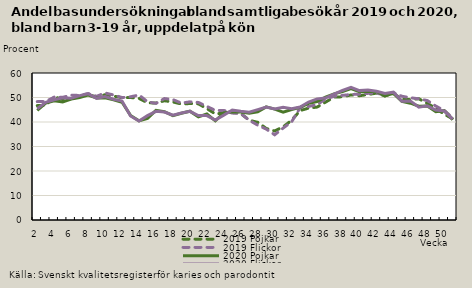
| Category | 2019 | 2020 |
|---|---|---|
| 2.0 | 48.324 | 45.404 |
| 3.0 | 48.345 | 48.023 |
| 4.0 | 50.156 | 49.076 |
| 5.0 | 50.065 | 49.895 |
| 6.0 | 50.969 | 49.659 |
| 7.0 | 50.824 | 50.776 |
| 8.0 | 51.581 | 51.555 |
| 9.0 | 50.495 | 49.663 |
| 10.0 | 51.846 | 50.419 |
| 11.0 | 51.03 | 49.299 |
| 12.0 | 49.98 | 48.567 |
| 13.0 | 50.278 | 42.472 |
| 14.0 | 51.036 | 40.433 |
| 15.0 | 48.258 | 42.593 |
| 16.0 | 47.594 | 44.341 |
| 17.0 | 49.583 | 44.054 |
| 18.0 | 49.144 | 42.753 |
| 19.0 | 47.707 | 43.693 |
| 20.0 | 48.225 | 44.363 |
| 21.0 | 47.986 | 42.663 |
| 22.0 | 46.375 | 42.608 |
| 23.0 | 44.722 | 40.761 |
| 24.0 | 44.732 | 42.79 |
| 25.0 | 43.632 | 44.874 |
| 26.0 | 43.436 | 44.405 |
| 27.0 | 40.722 | 44.03 |
| 28.0 | 38.711 | 45.054 |
| 29.0 | 37.116 | 46.08 |
| 30.0 | 34.781 | 45.296 |
| 31.0 | 37.524 | 46.008 |
| 32.0 | 40.088 | 45.466 |
| 33.0 | 45.845 | 46.115 |
| 34.0 | 46.344 | 48.16 |
| 35.0 | 47.09 | 49.444 |
| 36.0 | 49.365 | 49.792 |
| 37.0 | 50.486 | 51.36 |
| 38.0 | 50.876 | 52.868 |
| 39.0 | 51.216 | 54.116 |
| 40.0 | 51.383 | 52.809 |
| 41.0 | 51.681 | 53.077 |
| 42.0 | 51.785 | 52.556 |
| 43.0 | 51.049 | 51.612 |
| 44.0 | 51.977 | 52.174 |
| 45.0 | 50.519 | 48.511 |
| 46.0 | 49.894 | 48.605 |
| 47.0 | 49.471 | 46.045 |
| 48.0 | 48.752 | 46.596 |
| 49.0 | 46.487 | 44.892 |
| 50.0 | 44.691 | 44.47 |
| 51.0 | 41.594 | 41.172 |